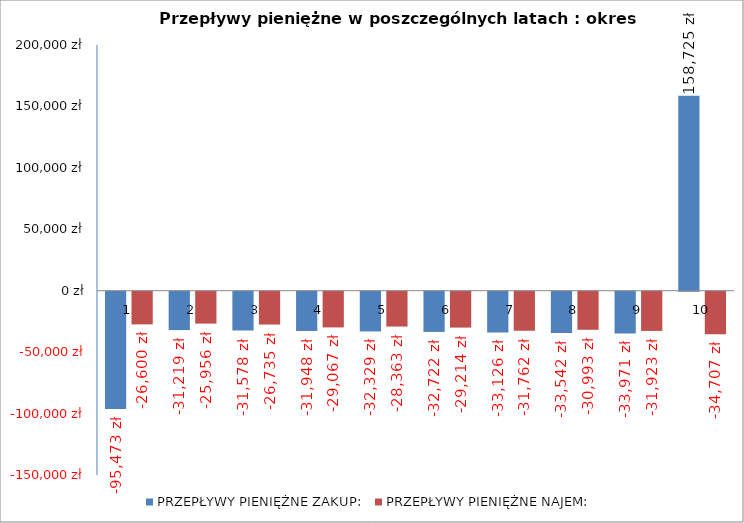
| Category | PRZEPŁYWY PIENIĘŻNE ZAKUP: | PRZEPŁYWY PIENIĘŻNE NAJEM: |
|---|---|---|
| 0 | -95472.749 | -26600 |
| 1 | -31218.969 | -25956 |
| 2 | -31578.15 | -26734.68 |
| 3 | -31948.107 | -29066.538 |
| 4 | -32329.163 | -28362.822 |
| 5 | -32721.651 | -29213.707 |
| 6 | -33125.913 | -31761.791 |
| 7 | -33542.303 | -30992.821 |
| 8 | -33971.184 | -31922.606 |
| 9 | 158725.493 | -34706.967 |